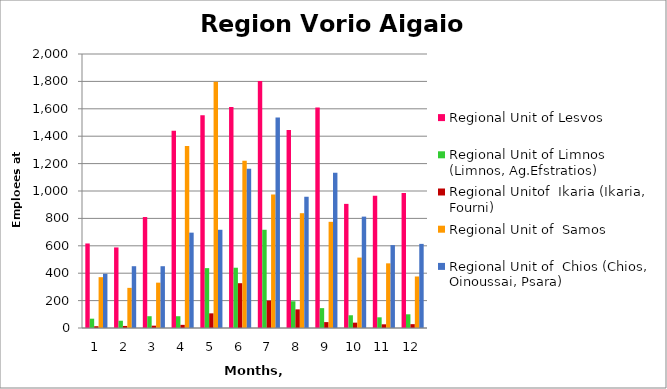
| Category | Regional Unit of Lesvos | Regional Unit of Limnos (Limnos, Ag.Efstratios) | Regional Unitof  Ikaria (Ikaria, Fourni) | Regional Unit of  Samos | Regional Unit of  Chios (Chios, Oinoussai, Psara) |
|---|---|---|---|---|---|
| 0 | 617 | 68 | 13 | 371 | 396 |
| 1 | 588 | 53 | 15 | 293 | 451 |
| 2 | 810 | 86 | 17 | 331 | 451 |
| 3 | 1440 | 86 | 23 | 1329 | 696 |
| 4 | 1553 | 437 | 107 | 1798 | 717 |
| 5 | 1613 | 440 | 327 | 1220 | 1162 |
| 6 | 1803 | 717 | 200 | 975 | 1536 |
| 7 | 1446 | 195 | 136 | 838 | 958 |
| 8 | 1609 | 145 | 43 | 775 | 1134 |
| 9 | 906 | 93 | 39 | 514 | 813 |
| 10 | 966 | 78 | 27 | 472 | 605 |
| 11 | 986 | 100 | 28 | 376 | 614 |